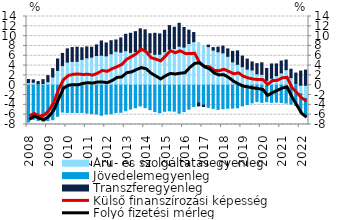
| Category | Áru- és szolgáltatásegyenleg | Jövedelemegyenleg | Transzferegyenleg |
|---|---|---|---|
| 2008.0 | 0.541 | -7.511 | 0.629 |
| 2008.0 | 0.609 | -6.943 | 0.476 |
| 2008.0 | 0.273 | -7.169 | 0.473 |
| 2008.0 | 0.346 | -7.328 | 0.793 |
| 2009.0 | 0.706 | -7.197 | 1.252 |
| 2009.0 | 1.675 | -7.025 | 1.701 |
| 2009.0 | 3.027 | -6.308 | 2.318 |
| 2009.0 | 4.007 | -5.459 | 2.474 |
| 2010.0 | 4.716 | -5.54 | 2.695 |
| 2010.0 | 4.854 | -5.546 | 2.821 |
| 2010.0 | 4.873 | -5.567 | 2.88 |
| 2010.0 | 5.257 | -5.543 | 2.369 |
| 2011.0 | 5.582 | -5.663 | 2.228 |
| 2011.0 | 5.735 | -5.785 | 2.009 |
| 2011.0 | 6.048 | -5.867 | 2.164 |
| 2011.0 | 6.111 | -6.106 | 2.904 |
| 2012.0 | 5.988 | -5.882 | 2.62 |
| 2012.0 | 6.402 | -5.807 | 2.663 |
| 2012.0 | 6.93 | -5.56 | 2.29 |
| 2012.0 | 6.747 | -5.513 | 2.894 |
| 2013.0 | 7.03 | -5.199 | 3.351 |
| 2013.0 | 6.699 | -4.853 | 3.877 |
| 2013.0 | 6.879 | -4.588 | 4.032 |
| 2013.0 | 6.969 | -4.228 | 4.52 |
| 2014.0 | 7.033 | -4.564 | 4.258 |
| 2014.0 | 6.621 | -4.975 | 3.87 |
| 2014.0 | 6.305 | -5.362 | 4.274 |
| 2014.0 | 6.314 | -5.597 | 4.144 |
| 2015.0 | 6.836 | -5.307 | 4.349 |
| 2015.0 | 7.306 | -5.215 | 4.841 |
| 2015.0 | 7.474 | -5.282 | 4.318 |
| 2015.0 | 7.941 | -5.692 | 4.671 |
| 2016.0 | 7.762 | -5.376 | 4.001 |
| 2016.0 | 8.501 | -4.869 | 2.722 |
| 2016.0 | 8.866 | -4.328 | 1.866 |
| 2016.0 | 8.671 | -3.64 | -0.569 |
| 2017.0 | 8.088 | -4.053 | -0.284 |
| 2017.0 | 7.86 | -4.507 | 0.303 |
| 2017.0 | 7.161 | -4.724 | 0.502 |
| 2017.0 | 6.819 | -4.916 | 0.941 |
| 2018.0 | 6.594 | -4.793 | 1.357 |
| 2018.0 | 5.893 | -4.688 | 1.506 |
| 2018.0 | 4.758 | -4.662 | 2.138 |
| 2018.0 | 4.266 | -4.588 | 2.733 |
| 2019.0 | 3.781 | -4.211 | 2.159 |
| 2019.0 | 3.279 | -3.938 | 2.046 |
| 2019.0 | 3.11 | -3.589 | 1.641 |
| 2019.0 | 2.331 | -3.334 | 2.066 |
| 2020.0 | 2.221 | -3.488 | 2.343 |
| 2020.0 | 0.98 | -3.361 | 2.445 |
| 2020.0 | 1.411 | -3.481 | 2.922 |
| 2020.0 | 1.944 | -3.447 | 2.4 |
| 2021.0 | 2.51 | -3.505 | 2.417 |
| 2021.0 | 3.166 | -3.625 | 1.963 |
| 2021.0 | 1.549 | -3.844 | 1.715 |
| 2021.0 | 0.304 | -4.098 | 2.171 |
| 2022.0 | -1.699 | -3.858 | 2.878 |
| 2022.0 | -2.679 | -3.737 | 3.089 |